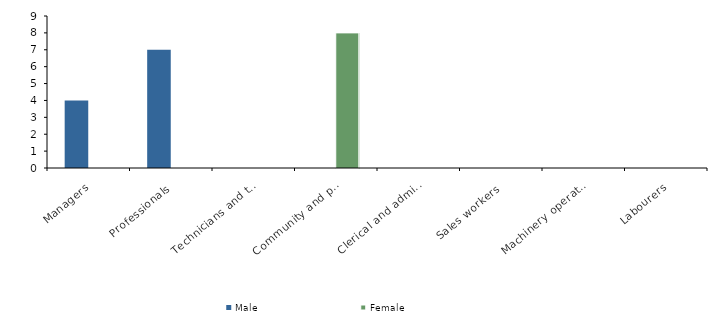
| Category | Male | Female |
|---|---|---|
| Managers | 4 | 0 |
| Professionals | 7 | 0 |
| Technicians and trades workers | 0 | 0 |
| Community and personal service workers | 0 | 8 |
| Clerical and administrative workers | 0 | 0 |
| Sales workers | 0 | 0 |
| Machinery operators and drivers | 0 | 0 |
| Labourers | 0 | 0 |